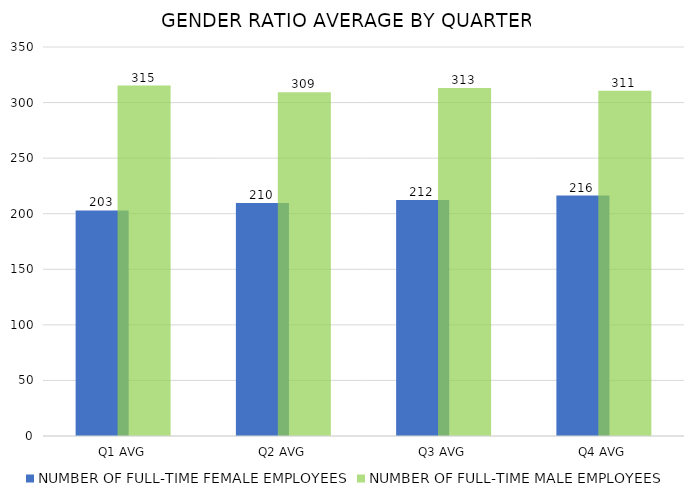
| Category | NUMBER OF FULL-TIME FEMALE EMPLOYEES | NUMBER OF FULL-TIME MALE EMPLOYEES |
|---|---|---|
| Q1 AVG | 203 | 315.333 |
| Q2 AVG | 209.667 | 309.333 |
| Q3 AVG | 212.333 | 313 |
| Q4 AVG | 216.333 | 310.667 |